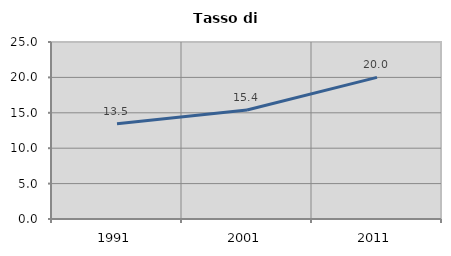
| Category | Tasso di disoccupazione   |
|---|---|
| 1991.0 | 13.462 |
| 2001.0 | 15.385 |
| 2011.0 | 20 |